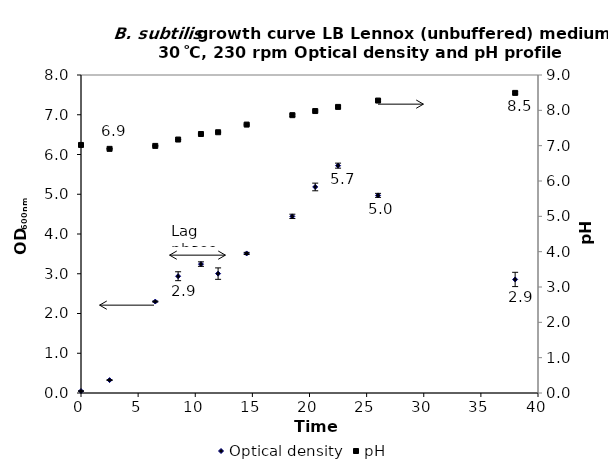
| Category | Optical density |
|---|---|
| 0.0 | 0.049 |
| 2.5 | 0.325 |
| 6.5 | 2.3 |
| 8.5 | 2.938 |
| 10.5 | 3.243 |
| 12.0 | 3.003 |
| 14.5 | 3.511 |
| 18.5 | 4.444 |
| 20.5 | 5.183 |
| 22.5 | 5.719 |
| 26.0 | 4.972 |
| 38.0 | 2.857 |